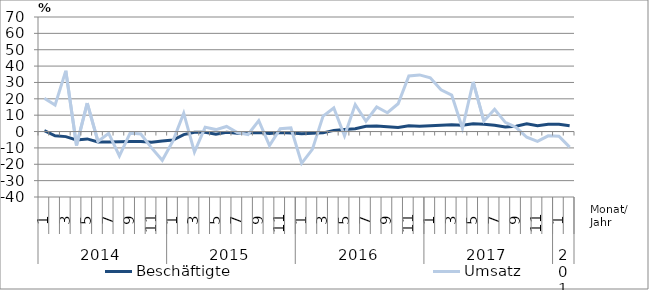
| Category | Beschäftigte | Umsatz |
|---|---|---|
| 0 | 0.5 | 20.3 |
| 1 | -2.6 | 16.2 |
| 2 | -3.1 | 37.1 |
| 3 | -5.1 | -8.5 |
| 4 | -4.5 | 17.4 |
| 5 | -6.4 | -6.1 |
| 6 | -6.4 | -1.1 |
| 7 | -6.2 | -14.9 |
| 8 | -6.1 | -0.9 |
| 9 | -6.1 | -1.5 |
| 10 | -6.6 | -10 |
| 11 | -5.8 | -17.6 |
| 12 | -5.2 | -5.7 |
| 13 | -1.9 | 11.2 |
| 14 | -0.5 | -12.5 |
| 15 | -0.5 | 2.7 |
| 16 | -1.7 | 1.2 |
| 17 | -0.5 | 3.1 |
| 18 | -1.1 | -0.6 |
| 19 | -0.8 | -1.8 |
| 20 | -0.6 | 6.7 |
| 21 | -1.2 | -8.6 |
| 22 | -0.6 | 1.7 |
| 23 | -0.9 | 2.2 |
| 24 | -1.3 | -19.4 |
| 25 | -1.1 | -10.9 |
| 26 | -0.8 | 9.4 |
| 27 | 0.7 | 14.4 |
| 28 | 1.2 | -2.6 |
| 29 | 1.7 | 16.5 |
| 30 | 3.2 | 6.3 |
| 31 | 3.4 | 15 |
| 32 | 3 | 11.5 |
| 33 | 2.5 | 17 |
| 34 | 3.6 | 34 |
| 35 | 3.2 | 34.6 |
| 36 | 3.5 | 32.8 |
| 37 | 3.8 | 25.5 |
| 38 | 4.2 | 22.3 |
| 39 | 3.9 | 2 |
| 40 | 4.7 | 30.3 |
| 41 | 4.4 | 6.4 |
| 42 | 3.9 | 13.6 |
| 43 | 2.8 | 5.6 |
| 44 | 3.3 | 2.6 |
| 45 | 4.7 | -3.5 |
| 46 | 3.5 | -6 |
| 47 | 4.5 | -2.6 |
| 48 | 4.4 | -2.8 |
| 49 | 3.5 | -9.5 |